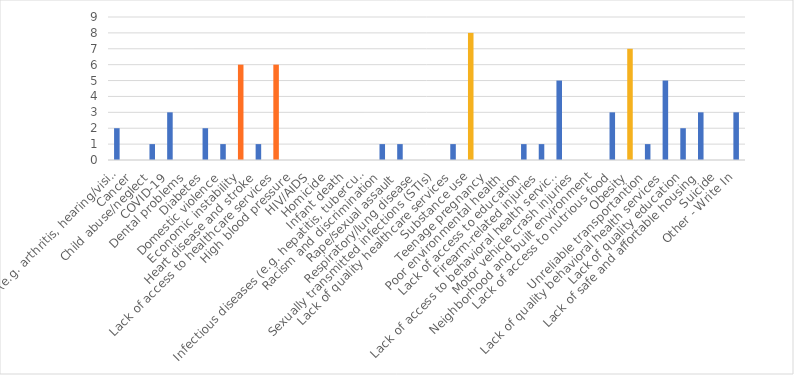
| Category | Number of Responses |
|---|---|
| Aging problems (e.g. arthritis, hearing/vision loss, etc.) | 2 |
| Cancer | 0 |
| Child abuse/neglect | 1 |
| COVID-19 | 3 |
| Dental problems | 0 |
| Diabetes | 2 |
| Domestic violence | 1 |
| Economic instability | 6 |
| Heart disease and stroke | 1 |
| Lack of access to healthcare services | 6 |
| High blood pressure | 0 |
| HIV/AIDS | 0 |
| Homicide | 0 |
| Infant death | 0 |
| Infectious diseases (e.g. hepatitis, tuberculosis, etc.) | 0 |
| Racism and discrimination | 1 |
| Rape/sexual assault | 1 |
| Respiratory/lung disease | 0 |
| Sexually transmitted infections (STIs) | 0 |
| Lack of quality healthcare services | 1 |
| Substance use | 8 |
| Teenage pregnancy | 0 |
| Poor environmental health | 0 |
| Lack of access to education | 1 |
| Firearm-related injuries | 1 |
| Lack of access to behavioral health services | 5 |
| Motor vehicle crash injuries | 0 |
| Neighborhood and built environment | 0 |
| Lack of access to nutrious food | 3 |
| Obesity | 7 |
| Unreliable transportantion | 1 |
| Lack of quality behavioral health services | 5 |
| Lack of quality education | 2 |
| Lack of safe and affortable housing | 3 |
| Suicide | 0 |
| Other - Write In | 3 |